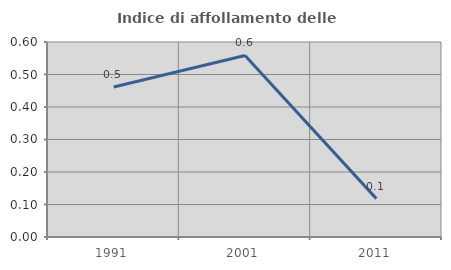
| Category | Indice di affollamento delle abitazioni  |
|---|---|
| 1991.0 | 0.462 |
| 2001.0 | 0.559 |
| 2011.0 | 0.118 |